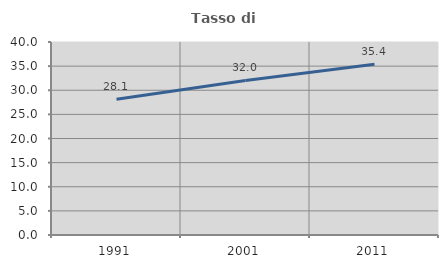
| Category | Tasso di occupazione   |
|---|---|
| 1991.0 | 28.139 |
| 2001.0 | 32.024 |
| 2011.0 | 35.375 |